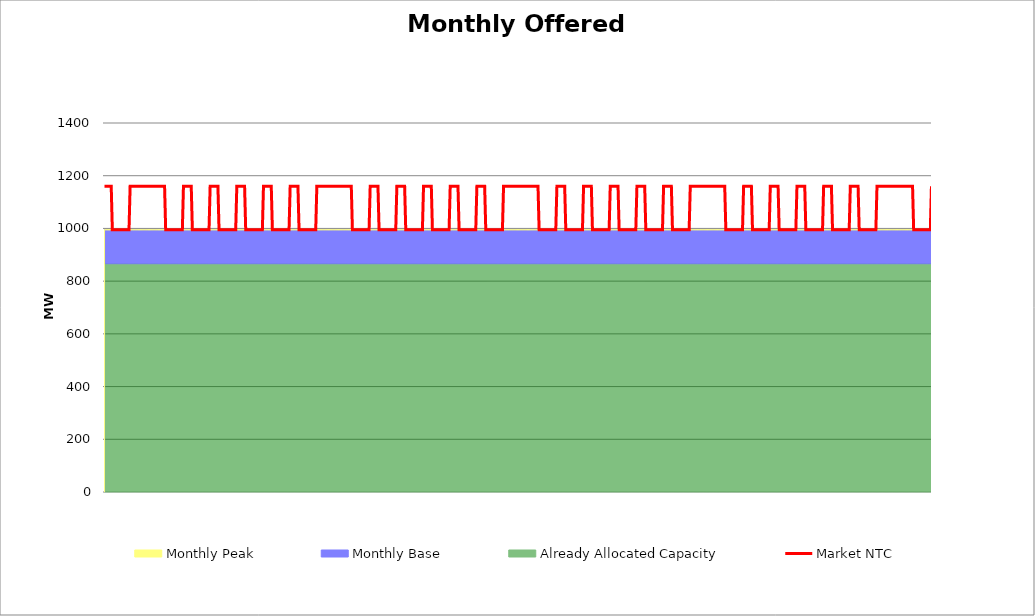
| Category | Market NTC |
|---|---|
| 0 | 1160 |
| 1 | 1160 |
| 2 | 1160 |
| 3 | 1160 |
| 4 | 1160 |
| 5 | 1160 |
| 6 | 1160 |
| 7 | 995 |
| 8 | 995 |
| 9 | 995 |
| 10 | 995 |
| 11 | 995 |
| 12 | 995 |
| 13 | 995 |
| 14 | 995 |
| 15 | 995 |
| 16 | 995 |
| 17 | 995 |
| 18 | 995 |
| 19 | 995 |
| 20 | 995 |
| 21 | 995 |
| 22 | 995 |
| 23 | 1160 |
| 24 | 1160 |
| 25 | 1160 |
| 26 | 1160 |
| 27 | 1160 |
| 28 | 1160 |
| 29 | 1160 |
| 30 | 1160 |
| 31 | 1160 |
| 32 | 1160 |
| 33 | 1160 |
| 34 | 1160 |
| 35 | 1160 |
| 36 | 1160 |
| 37 | 1160 |
| 38 | 1160 |
| 39 | 1160 |
| 40 | 1160 |
| 41 | 1160 |
| 42 | 1160 |
| 43 | 1160 |
| 44 | 1160 |
| 45 | 1160 |
| 46 | 1160 |
| 47 | 1160 |
| 48 | 1160 |
| 49 | 1160 |
| 50 | 1160 |
| 51 | 1160 |
| 52 | 1160 |
| 53 | 1160 |
| 54 | 1160 |
| 55 | 995 |
| 56 | 995 |
| 57 | 995 |
| 58 | 995 |
| 59 | 995 |
| 60 | 995 |
| 61 | 995 |
| 62 | 995 |
| 63 | 995 |
| 64 | 995 |
| 65 | 995 |
| 66 | 995 |
| 67 | 995 |
| 68 | 995 |
| 69 | 995 |
| 70 | 995 |
| 71 | 1160 |
| 72 | 1160 |
| 73 | 1160 |
| 74 | 1160 |
| 75 | 1160 |
| 76 | 1160 |
| 77 | 1160 |
| 78 | 1160 |
| 79 | 995 |
| 80 | 995 |
| 81 | 995 |
| 82 | 995 |
| 83 | 995 |
| 84 | 995 |
| 85 | 995 |
| 86 | 995 |
| 87 | 995 |
| 88 | 995 |
| 89 | 995 |
| 90 | 995 |
| 91 | 995 |
| 92 | 995 |
| 93 | 995 |
| 94 | 995 |
| 95 | 1160 |
| 96 | 1160 |
| 97 | 1160 |
| 98 | 1160 |
| 99 | 1160 |
| 100 | 1160 |
| 101 | 1160 |
| 102 | 1160 |
| 103 | 995 |
| 104 | 995 |
| 105 | 995 |
| 106 | 995 |
| 107 | 995 |
| 108 | 995 |
| 109 | 995 |
| 110 | 995 |
| 111 | 995 |
| 112 | 995 |
| 113 | 995 |
| 114 | 995 |
| 115 | 995 |
| 116 | 995 |
| 117 | 995 |
| 118 | 995 |
| 119 | 1160 |
| 120 | 1160 |
| 121 | 1160 |
| 122 | 1160 |
| 123 | 1160 |
| 124 | 1160 |
| 125 | 1160 |
| 126 | 1160 |
| 127 | 995 |
| 128 | 995 |
| 129 | 995 |
| 130 | 995 |
| 131 | 995 |
| 132 | 995 |
| 133 | 995 |
| 134 | 995 |
| 135 | 995 |
| 136 | 995 |
| 137 | 995 |
| 138 | 995 |
| 139 | 995 |
| 140 | 995 |
| 141 | 995 |
| 142 | 995 |
| 143 | 1160 |
| 144 | 1160 |
| 145 | 1160 |
| 146 | 1160 |
| 147 | 1160 |
| 148 | 1160 |
| 149 | 1160 |
| 150 | 1160 |
| 151 | 995 |
| 152 | 995 |
| 153 | 995 |
| 154 | 995 |
| 155 | 995 |
| 156 | 995 |
| 157 | 995 |
| 158 | 995 |
| 159 | 995 |
| 160 | 995 |
| 161 | 995 |
| 162 | 995 |
| 163 | 995 |
| 164 | 995 |
| 165 | 995 |
| 166 | 995 |
| 167 | 1160 |
| 168 | 1160 |
| 169 | 1160 |
| 170 | 1160 |
| 171 | 1160 |
| 172 | 1160 |
| 173 | 1160 |
| 174 | 1160 |
| 175 | 995 |
| 176 | 995 |
| 177 | 995 |
| 178 | 995 |
| 179 | 995 |
| 180 | 995 |
| 181 | 995 |
| 182 | 995 |
| 183 | 995 |
| 184 | 995 |
| 185 | 995 |
| 186 | 995 |
| 187 | 995 |
| 188 | 995 |
| 189 | 995 |
| 190 | 995 |
| 191 | 1160 |
| 192 | 1160 |
| 193 | 1160 |
| 194 | 1160 |
| 195 | 1160 |
| 196 | 1160 |
| 197 | 1160 |
| 198 | 1160 |
| 199 | 1160 |
| 200 | 1160 |
| 201 | 1160 |
| 202 | 1160 |
| 203 | 1160 |
| 204 | 1160 |
| 205 | 1160 |
| 206 | 1160 |
| 207 | 1160 |
| 208 | 1160 |
| 209 | 1160 |
| 210 | 1160 |
| 211 | 1160 |
| 212 | 1160 |
| 213 | 1160 |
| 214 | 1160 |
| 215 | 1160 |
| 216 | 1160 |
| 217 | 1160 |
| 218 | 1160 |
| 219 | 1160 |
| 220 | 1160 |
| 221 | 1160 |
| 222 | 1160 |
| 223 | 995 |
| 224 | 995 |
| 225 | 995 |
| 226 | 995 |
| 227 | 995 |
| 228 | 995 |
| 229 | 995 |
| 230 | 995 |
| 231 | 995 |
| 232 | 995 |
| 233 | 995 |
| 234 | 995 |
| 235 | 995 |
| 236 | 995 |
| 237 | 995 |
| 238 | 995 |
| 239 | 1160 |
| 240 | 1160 |
| 241 | 1160 |
| 242 | 1160 |
| 243 | 1160 |
| 244 | 1160 |
| 245 | 1160 |
| 246 | 1160 |
| 247 | 995 |
| 248 | 995 |
| 249 | 995 |
| 250 | 995 |
| 251 | 995 |
| 252 | 995 |
| 253 | 995 |
| 254 | 995 |
| 255 | 995 |
| 256 | 995 |
| 257 | 995 |
| 258 | 995 |
| 259 | 995 |
| 260 | 995 |
| 261 | 995 |
| 262 | 995 |
| 263 | 1160 |
| 264 | 1160 |
| 265 | 1160 |
| 266 | 1160 |
| 267 | 1160 |
| 268 | 1160 |
| 269 | 1160 |
| 270 | 1160 |
| 271 | 995 |
| 272 | 995 |
| 273 | 995 |
| 274 | 995 |
| 275 | 995 |
| 276 | 995 |
| 277 | 995 |
| 278 | 995 |
| 279 | 995 |
| 280 | 995 |
| 281 | 995 |
| 282 | 995 |
| 283 | 995 |
| 284 | 995 |
| 285 | 995 |
| 286 | 995 |
| 287 | 1160 |
| 288 | 1160 |
| 289 | 1160 |
| 290 | 1160 |
| 291 | 1160 |
| 292 | 1160 |
| 293 | 1160 |
| 294 | 1160 |
| 295 | 995 |
| 296 | 995 |
| 297 | 995 |
| 298 | 995 |
| 299 | 995 |
| 300 | 995 |
| 301 | 995 |
| 302 | 995 |
| 303 | 995 |
| 304 | 995 |
| 305 | 995 |
| 306 | 995 |
| 307 | 995 |
| 308 | 995 |
| 309 | 995 |
| 310 | 995 |
| 311 | 1160 |
| 312 | 1160 |
| 313 | 1160 |
| 314 | 1160 |
| 315 | 1160 |
| 316 | 1160 |
| 317 | 1160 |
| 318 | 1160 |
| 319 | 995 |
| 320 | 995 |
| 321 | 995 |
| 322 | 995 |
| 323 | 995 |
| 324 | 995 |
| 325 | 995 |
| 326 | 995 |
| 327 | 995 |
| 328 | 995 |
| 329 | 995 |
| 330 | 995 |
| 331 | 995 |
| 332 | 995 |
| 333 | 995 |
| 334 | 995 |
| 335 | 1160 |
| 336 | 1160 |
| 337 | 1160 |
| 338 | 1160 |
| 339 | 1160 |
| 340 | 1160 |
| 341 | 1160 |
| 342 | 1160 |
| 343 | 995 |
| 344 | 995 |
| 345 | 995 |
| 346 | 995 |
| 347 | 995 |
| 348 | 995 |
| 349 | 995 |
| 350 | 995 |
| 351 | 995 |
| 352 | 995 |
| 353 | 995 |
| 354 | 995 |
| 355 | 995 |
| 356 | 995 |
| 357 | 995 |
| 358 | 995 |
| 359 | 1160 |
| 360 | 1160 |
| 361 | 1160 |
| 362 | 1160 |
| 363 | 1160 |
| 364 | 1160 |
| 365 | 1160 |
| 366 | 1160 |
| 367 | 1160 |
| 368 | 1160 |
| 369 | 1160 |
| 370 | 1160 |
| 371 | 1160 |
| 372 | 1160 |
| 373 | 1160 |
| 374 | 1160 |
| 375 | 1160 |
| 376 | 1160 |
| 377 | 1160 |
| 378 | 1160 |
| 379 | 1160 |
| 380 | 1160 |
| 381 | 1160 |
| 382 | 1160 |
| 383 | 1160 |
| 384 | 1160 |
| 385 | 1160 |
| 386 | 1160 |
| 387 | 1160 |
| 388 | 1160 |
| 389 | 1160 |
| 390 | 1160 |
| 391 | 995 |
| 392 | 995 |
| 393 | 995 |
| 394 | 995 |
| 395 | 995 |
| 396 | 995 |
| 397 | 995 |
| 398 | 995 |
| 399 | 995 |
| 400 | 995 |
| 401 | 995 |
| 402 | 995 |
| 403 | 995 |
| 404 | 995 |
| 405 | 995 |
| 406 | 995 |
| 407 | 1160 |
| 408 | 1160 |
| 409 | 1160 |
| 410 | 1160 |
| 411 | 1160 |
| 412 | 1160 |
| 413 | 1160 |
| 414 | 1160 |
| 415 | 995 |
| 416 | 995 |
| 417 | 995 |
| 418 | 995 |
| 419 | 995 |
| 420 | 995 |
| 421 | 995 |
| 422 | 995 |
| 423 | 995 |
| 424 | 995 |
| 425 | 995 |
| 426 | 995 |
| 427 | 995 |
| 428 | 995 |
| 429 | 995 |
| 430 | 995 |
| 431 | 1160 |
| 432 | 1160 |
| 433 | 1160 |
| 434 | 1160 |
| 435 | 1160 |
| 436 | 1160 |
| 437 | 1160 |
| 438 | 1160 |
| 439 | 995 |
| 440 | 995 |
| 441 | 995 |
| 442 | 995 |
| 443 | 995 |
| 444 | 995 |
| 445 | 995 |
| 446 | 995 |
| 447 | 995 |
| 448 | 995 |
| 449 | 995 |
| 450 | 995 |
| 451 | 995 |
| 452 | 995 |
| 453 | 995 |
| 454 | 995 |
| 455 | 1160 |
| 456 | 1160 |
| 457 | 1160 |
| 458 | 1160 |
| 459 | 1160 |
| 460 | 1160 |
| 461 | 1160 |
| 462 | 1160 |
| 463 | 995 |
| 464 | 995 |
| 465 | 995 |
| 466 | 995 |
| 467 | 995 |
| 468 | 995 |
| 469 | 995 |
| 470 | 995 |
| 471 | 995 |
| 472 | 995 |
| 473 | 995 |
| 474 | 995 |
| 475 | 995 |
| 476 | 995 |
| 477 | 995 |
| 478 | 995 |
| 479 | 1160 |
| 480 | 1160 |
| 481 | 1160 |
| 482 | 1160 |
| 483 | 1160 |
| 484 | 1160 |
| 485 | 1160 |
| 486 | 1160 |
| 487 | 995 |
| 488 | 995 |
| 489 | 995 |
| 490 | 995 |
| 491 | 995 |
| 492 | 995 |
| 493 | 995 |
| 494 | 995 |
| 495 | 995 |
| 496 | 995 |
| 497 | 995 |
| 498 | 995 |
| 499 | 995 |
| 500 | 995 |
| 501 | 995 |
| 502 | 995 |
| 503 | 1160 |
| 504 | 1160 |
| 505 | 1160 |
| 506 | 1160 |
| 507 | 1160 |
| 508 | 1160 |
| 509 | 1160 |
| 510 | 1160 |
| 511 | 995 |
| 512 | 995 |
| 513 | 995 |
| 514 | 995 |
| 515 | 995 |
| 516 | 995 |
| 517 | 995 |
| 518 | 995 |
| 519 | 995 |
| 520 | 995 |
| 521 | 995 |
| 522 | 995 |
| 523 | 995 |
| 524 | 995 |
| 525 | 995 |
| 526 | 995 |
| 527 | 1160 |
| 528 | 1160 |
| 529 | 1160 |
| 530 | 1160 |
| 531 | 1160 |
| 532 | 1160 |
| 533 | 1160 |
| 534 | 1160 |
| 535 | 1160 |
| 536 | 1160 |
| 537 | 1160 |
| 538 | 1160 |
| 539 | 1160 |
| 540 | 1160 |
| 541 | 1160 |
| 542 | 1160 |
| 543 | 1160 |
| 544 | 1160 |
| 545 | 1160 |
| 546 | 1160 |
| 547 | 1160 |
| 548 | 1160 |
| 549 | 1160 |
| 550 | 1160 |
| 551 | 1160 |
| 552 | 1160 |
| 553 | 1160 |
| 554 | 1160 |
| 555 | 1160 |
| 556 | 1160 |
| 557 | 1160 |
| 558 | 1160 |
| 559 | 995 |
| 560 | 995 |
| 561 | 995 |
| 562 | 995 |
| 563 | 995 |
| 564 | 995 |
| 565 | 995 |
| 566 | 995 |
| 567 | 995 |
| 568 | 995 |
| 569 | 995 |
| 570 | 995 |
| 571 | 995 |
| 572 | 995 |
| 573 | 995 |
| 574 | 995 |
| 575 | 1160 |
| 576 | 1160 |
| 577 | 1160 |
| 578 | 1160 |
| 579 | 1160 |
| 580 | 1160 |
| 581 | 1160 |
| 582 | 1160 |
| 583 | 995 |
| 584 | 995 |
| 585 | 995 |
| 586 | 995 |
| 587 | 995 |
| 588 | 995 |
| 589 | 995 |
| 590 | 995 |
| 591 | 995 |
| 592 | 995 |
| 593 | 995 |
| 594 | 995 |
| 595 | 995 |
| 596 | 995 |
| 597 | 995 |
| 598 | 995 |
| 599 | 1160 |
| 600 | 1160 |
| 601 | 1160 |
| 602 | 1160 |
| 603 | 1160 |
| 604 | 1160 |
| 605 | 1160 |
| 606 | 1160 |
| 607 | 995 |
| 608 | 995 |
| 609 | 995 |
| 610 | 995 |
| 611 | 995 |
| 612 | 995 |
| 613 | 995 |
| 614 | 995 |
| 615 | 995 |
| 616 | 995 |
| 617 | 995 |
| 618 | 995 |
| 619 | 995 |
| 620 | 995 |
| 621 | 995 |
| 622 | 995 |
| 623 | 1160 |
| 624 | 1160 |
| 625 | 1160 |
| 626 | 1160 |
| 627 | 1160 |
| 628 | 1160 |
| 629 | 1160 |
| 630 | 1160 |
| 631 | 995 |
| 632 | 995 |
| 633 | 995 |
| 634 | 995 |
| 635 | 995 |
| 636 | 995 |
| 637 | 995 |
| 638 | 995 |
| 639 | 995 |
| 640 | 995 |
| 641 | 995 |
| 642 | 995 |
| 643 | 995 |
| 644 | 995 |
| 645 | 995 |
| 646 | 995 |
| 647 | 1160 |
| 648 | 1160 |
| 649 | 1160 |
| 650 | 1160 |
| 651 | 1160 |
| 652 | 1160 |
| 653 | 1160 |
| 654 | 1160 |
| 655 | 995 |
| 656 | 995 |
| 657 | 995 |
| 658 | 995 |
| 659 | 995 |
| 660 | 995 |
| 661 | 995 |
| 662 | 995 |
| 663 | 995 |
| 664 | 995 |
| 665 | 995 |
| 666 | 995 |
| 667 | 995 |
| 668 | 995 |
| 669 | 995 |
| 670 | 995 |
| 671 | 1160 |
| 672 | 1160 |
| 673 | 1160 |
| 674 | 1160 |
| 675 | 1160 |
| 676 | 1160 |
| 677 | 1160 |
| 678 | 1160 |
| 679 | 995 |
| 680 | 995 |
| 681 | 995 |
| 682 | 995 |
| 683 | 995 |
| 684 | 995 |
| 685 | 995 |
| 686 | 995 |
| 687 | 995 |
| 688 | 995 |
| 689 | 995 |
| 690 | 995 |
| 691 | 995 |
| 692 | 995 |
| 693 | 995 |
| 694 | 995 |
| 695 | 1160 |
| 696 | 1160 |
| 697 | 1160 |
| 698 | 1160 |
| 699 | 1160 |
| 700 | 1160 |
| 701 | 1160 |
| 702 | 1160 |
| 703 | 1160 |
| 704 | 1160 |
| 705 | 1160 |
| 706 | 1160 |
| 707 | 1160 |
| 708 | 1160 |
| 709 | 1160 |
| 710 | 1160 |
| 711 | 1160 |
| 712 | 1160 |
| 713 | 1160 |
| 714 | 1160 |
| 715 | 1160 |
| 716 | 1160 |
| 717 | 1160 |
| 718 | 1160 |
| 719 | 1160 |
| 720 | 1160 |
| 721 | 1160 |
| 722 | 1160 |
| 723 | 1160 |
| 724 | 1160 |
| 725 | 1160 |
| 726 | 1160 |
| 727 | 1160 |
| 728 | 995 |
| 729 | 995 |
| 730 | 995 |
| 731 | 995 |
| 732 | 995 |
| 733 | 995 |
| 734 | 995 |
| 735 | 995 |
| 736 | 995 |
| 737 | 995 |
| 738 | 995 |
| 739 | 995 |
| 740 | 995 |
| 741 | 995 |
| 742 | 995 |
| 743 | 995 |
| 744 | 1160 |